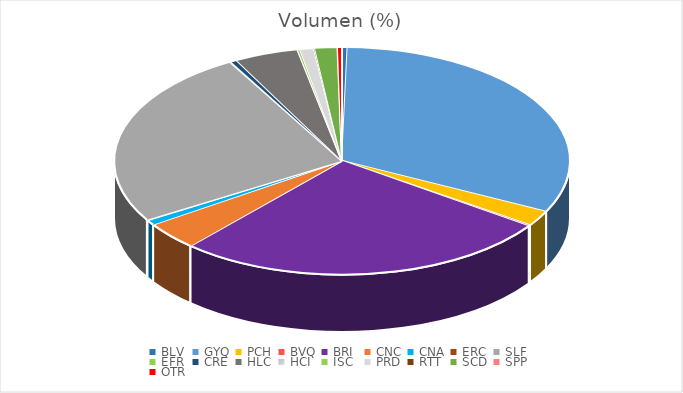
| Category | Volumen (%) |
|---|---|
| BLV | 26604.1 |
| GYQ | 2187034.15 |
| PCH | 151246.5 |
| BVQ | 10650 |
| BRI | 1836000 |
| CNC | 271346.85 |
| CNA | 50989 |
| ERC | 3956 |
| SLF | 1742185.3 |
| EFR | 6240 |
| CRE | 29914.5 |
| HLC | 309138.93 |
| HCI | 2338.7 |
| ISC | 10650 |
| PRD | 67087.52 |
| RTT | 5239.4 |
| SCD | 108529.03 |
| SPP | 2146.25 |
| OTR | 19524.6 |